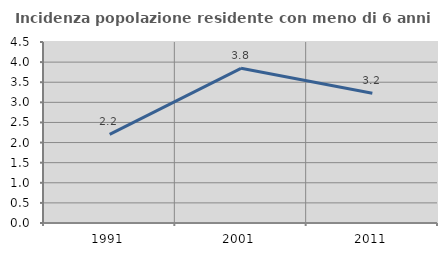
| Category | Incidenza popolazione residente con meno di 6 anni |
|---|---|
| 1991.0 | 2.205 |
| 2001.0 | 3.846 |
| 2011.0 | 3.226 |